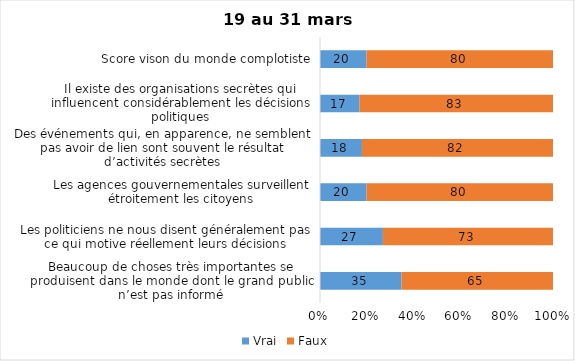
| Category | Vrai | Faux |
|---|---|---|
| Beaucoup de choses très importantes se produisent dans le monde dont le grand public n’est pas informé | 35 | 65 |
| Les politiciens ne nous disent généralement pas ce qui motive réellement leurs décisions | 27 | 73 |
| Les agences gouvernementales surveillent étroitement les citoyens | 20 | 80 |
| Des événements qui, en apparence, ne semblent pas avoir de lien sont souvent le résultat d’activités secrètes | 18 | 82 |
| Il existe des organisations secrètes qui influencent considérablement les décisions politiques | 17 | 83 |
| Score vison du monde complotiste | 20 | 80 |